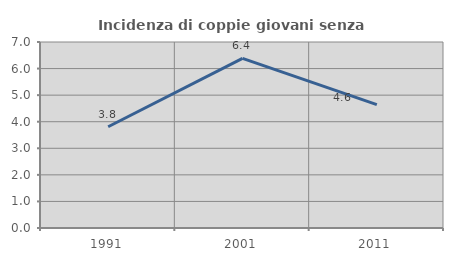
| Category | Incidenza di coppie giovani senza figli |
|---|---|
| 1991.0 | 3.81 |
| 2001.0 | 6.383 |
| 2011.0 | 4.643 |